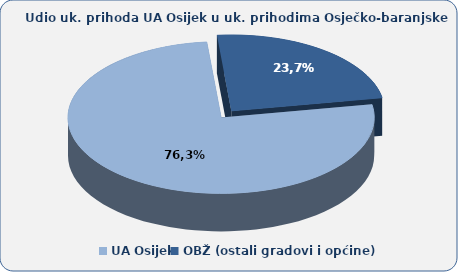
| Category | 76,3 23,7 |
|---|---|
| UA Osijek | 76.28 |
| OBŽ (ostali gradovi i općine) | 23.72 |